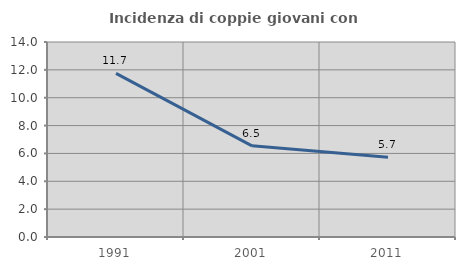
| Category | Incidenza di coppie giovani con figli |
|---|---|
| 1991.0 | 11.749 |
| 2001.0 | 6.545 |
| 2011.0 | 5.729 |